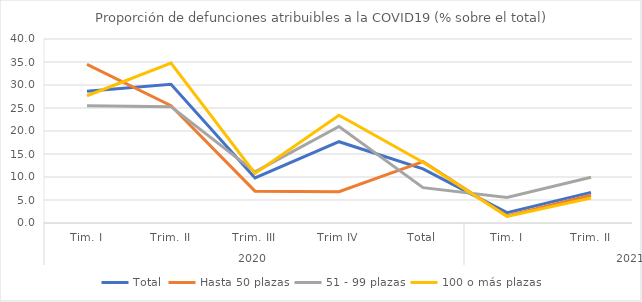
| Category | Total | Hasta 50 plazas | 51 - 99 plazas | 100 o más plazas |
|---|---|---|---|---|
| 0 | 28.62 | 34.483 | 25.49 | 27.66 |
| 1 | 30.168 | 25.485 | 25.287 | 34.773 |
| 2 | 9.789 | 6.92 | 11.111 | 10.784 |
| 3 | 17.673 | 6.818 | 20.992 | 23.438 |
| 4 | 11.769 | 13.356 | 7.692 | 13.208 |
| 5 | 2.239 | 1.523 | 5.556 | 1.441 |
| 6 | 6.65 | 6.019 | 9.948 | 5.432 |